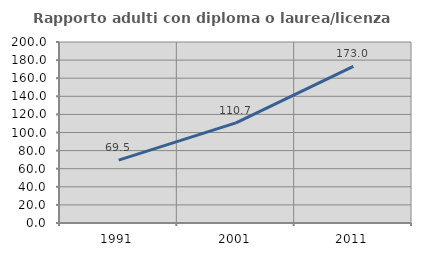
| Category | Rapporto adulti con diploma o laurea/licenza media  |
|---|---|
| 1991.0 | 69.548 |
| 2001.0 | 110.667 |
| 2011.0 | 173.047 |